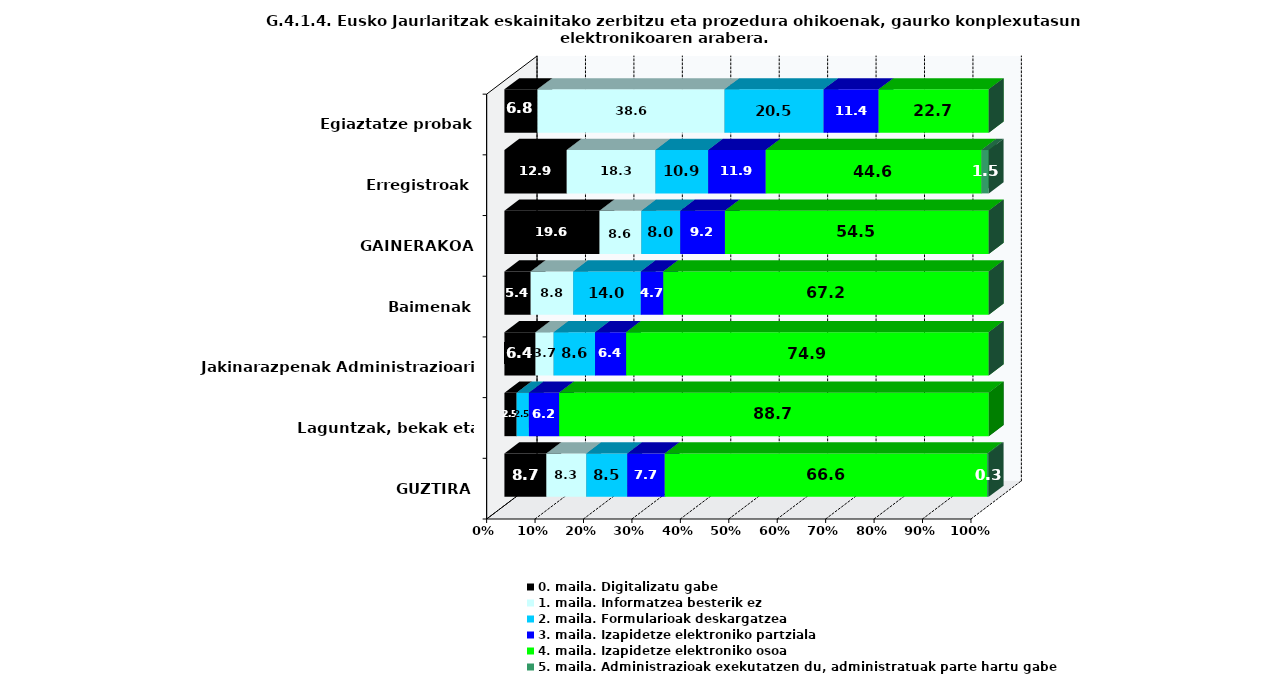
| Category | 0. maila. Digitalizatu gabe | 1. maila. Informatzea besterik ez | 2. maila. Formularioak deskargatzea | 3. maila. Izapidetze elektroniko partziala | 4. maila. Izapidetze elektroniko osoa | 5. maila. Administrazioak exekutatzen du, administratuak parte hartu gabe |
|---|---|---|---|---|---|---|
| GUZTIRA | 8.662 | 8.252 | 8.457 | 7.74 | 66.581 | 0.308 |
| Laguntzak, bekak eta diru-laguntzak | 2.53 | 0 | 2.53 | 6.239 | 88.702 | 0 |
| Jakinarazpenak Administrazioari | 6.417 | 3.743 | 8.556 | 6.417 | 74.866 | 0 |
| Baimenak | 5.426 | 8.786 | 13.953 | 4.651 | 67.183 | 0 |
| GAINERAKOA | 19.643 | 8.631 | 8.036 | 9.226 | 54.464 | 0 |
| Erregistroak | 12.871 | 18.317 | 10.891 | 11.881 | 44.554 | 1.485 |
| Egiaztatze probak | 6.818 | 38.636 | 20.455 | 11.364 | 22.727 | 0 |